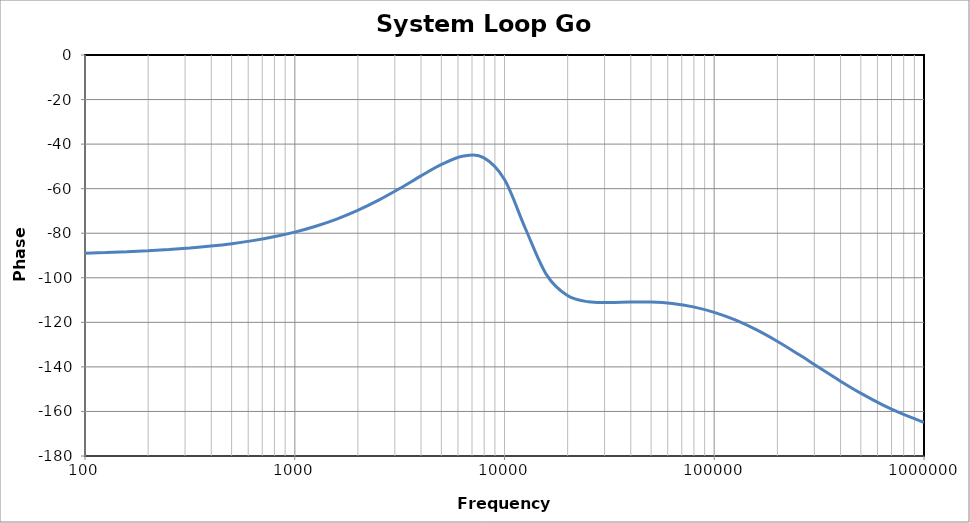
| Category | System Loop Phase |
|---|---|
| 100.0 | -88.937 |
| 125.89254117941677 | -88.662 |
| 158.48931924611153 | -88.316 |
| 199.52623149688802 | -87.88 |
| 251.18864315095806 | -87.332 |
| 316.22776601683825 | -86.642 |
| 398.1071705534976 | -85.776 |
| 501.1872336272727 | -84.688 |
| 630.9573444801932 | -83.324 |
| 794.3282347242821 | -81.619 |
| 1000.0 | -79.494 |
| 1258.925411794168 | -76.864 |
| 1584.8931924611156 | -73.64 |
| 1995.2623149688804 | -69.745 |
| 2511.886431509581 | -65.153 |
| 3162.2776601683804 | -59.938 |
| 3981.071705534977 | -54.381 |
| 5011.872336272732 | -49.12 |
| 6309.573444801938 | -45.461 |
| 7943.282347242815 | -46.052 |
| 10000.0 | -55.902 |
| 12589.254117941671 | -77.994 |
| 15848.931924611146 | -98.575 |
| 19952.623149688792 | -107.98 |
| 25118.86431509586 | -110.791 |
| 31622.77660168384 | -111.117 |
| 39810.71705534974 | -110.865 |
| 50118.723362727294 | -110.881 |
| 63095.73444801934 | -111.553 |
| 79432.82347242824 | -113.069 |
| 100000.0 | -115.523 |
| 125892.54117941685 | -118.947 |
| 158489.31924611164 | -123.307 |
| 199526.23149688813 | -128.486 |
| 251188.64315095844 | -134.261 |
| 316227.7660168382 | -140.318 |
| 398107.17055349716 | -146.307 |
| 501187.23362727347 | -151.914 |
| 630957.3444801942 | -156.928 |
| 794328.2347242833 | -161.253 |
| 1000000.0 | -164.883 |